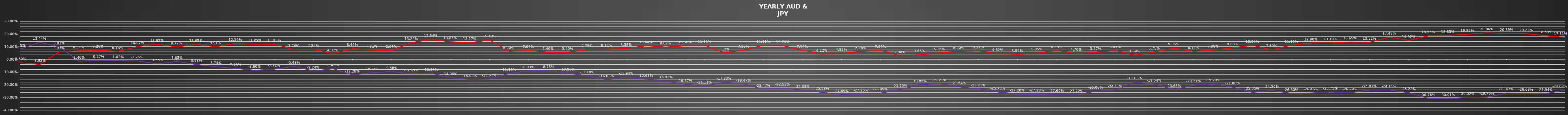
| Category | Series 0 | Series 1 |
|---|---|---|
| 0 | -0.026 | 0.082 |
| 1 | -0.039 | 0.134 |
| 2 | 0.06 | 0.038 |
| 3 | 0.066 | -0.015 |
| 4 | 0.073 | -0.008 |
| 5 | 0.062 | -0.01 |
| 6 | 0.101 | -0.012 |
| 7 | 0.119 | -0.036 |
| 8 | 0.098 | -0.016 |
| 9 | 0.116 | -0.04 |
| 10 | 0.099 | -0.057 |
| 11 | 0.126 | -0.072 |
| 12 | 0.118 | -0.086 |
| 13 | 0.12 | -0.077 |
| 14 | 0.078 | -0.055 |
| 15 | 0.078 | -0.092 |
| 16 | 0.044 | -0.074 |
| 17 | 0.085 | -0.123 |
| 18 | 0.073 | -0.105 |
| 19 | 0.07 | -0.096 |
| 20 | 0.132 | -0.114 |
| 21 | 0.156 | -0.11 |
| 22 | 0.139 | -0.143 |
| 23 | 0.132 | -0.159 |
| 24 | 0.152 | -0.156 |
| 25 | 0.062 | -0.111 |
| 26 | 0.07 | -0.089 |
| 27 | 0.054 | -0.088 |
| 28 | 0.054 | -0.109 |
| 29 | 0.078 | -0.131 |
| 30 | 0.081 | -0.161 |
| 31 | 0.086 | -0.139 |
| 32 | 0.106 | -0.156 |
| 33 | 0.096 | -0.169 |
| 34 | 0.106 | -0.197 |
| 35 | 0.11 | -0.211 |
| 36 | 0.051 | -0.178 |
| 37 | 0.072 | -0.195 |
| 38 | 0.111 | -0.235 |
| 39 | 0.107 | -0.225 |
| 40 | 0.071 | -0.243 |
| 41 | 0.041 | -0.259 |
| 42 | 0.048 | -0.277 |
| 43 | 0.062 | -0.272 |
| 44 | 0.07 | -0.265 |
| 45 | 0.028 | -0.238 |
| 46 | 0.036 | -0.198 |
| 47 | 0.052 | -0.192 |
| 48 | 0.062 | -0.215 |
| 49 | 0.065 | -0.232 |
| 50 | 0.046 | -0.258 |
| 51 | 0.04 | -0.272 |
| 52 | 0.05 | -0.273 |
| 53 | 0.068 | -0.276 |
| 54 | 0.047 | -0.277 |
| 55 | 0.056 | -0.25 |
| 56 | 0.068 | -0.241 |
| 57 | 0.034 | -0.176 |
| 58 | 0.058 | -0.195 |
| 59 | 0.09 | -0.236 |
| 60 | 0.061 | -0.202 |
| 61 | 0.074 | -0.193 |
| 62 | 0.091 | -0.218 |
| 63 | 0.11 | -0.26 |
| 64 | 0.076 | -0.245 |
| 65 | 0.112 | -0.268 |
| 66 | 0.129 | -0.265 |
| 67 | 0.131 | -0.258 |
| 68 | 0.136 | -0.263 |
| 69 | 0.135 | -0.241 |
| 70 | 0.174 | -0.241 |
| 71 | 0.149 | -0.262 |
| 72 | 0.186 | -0.308 |
| 73 | 0.188 | -0.309 |
| 74 | 0.198 | -0.3 |
| 75 | 0.209 | -0.298 |
| 76 | 0.204 | -0.265 |
| 77 | 0.202 | -0.267 |
| 78 | 0.186 | -0.269 |
| 79 | 0.173 | -0.241 |